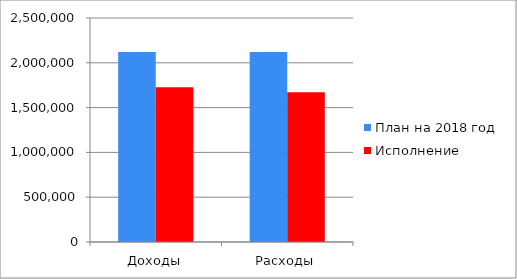
| Category | План на 2018 год | Исполнение |
|---|---|---|
| Доходы | 2121352.3 | 1728344.8 |
| Расходы | 2119881.5 | 1670354.6 |